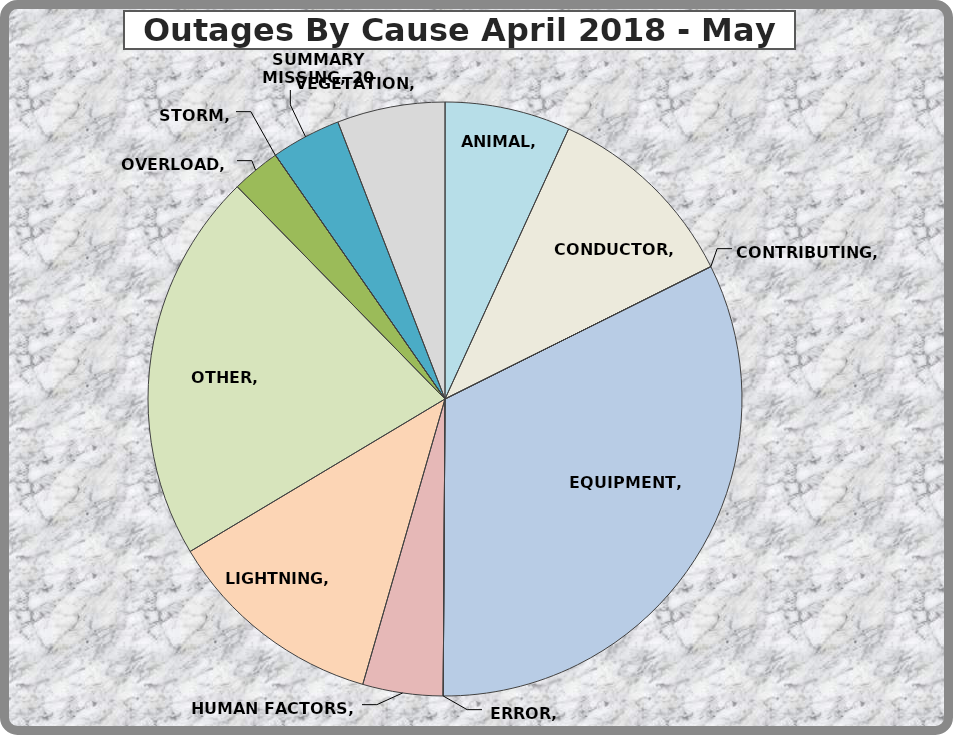
| Category | Series 0 |
|---|---|
| ANIMAL | 36 |
| CONDUCTOR | 57 |
| CONTRIBUTING | 0 |
| EQUIPMENT | 171 |
| ERROR | 0 |
| HUMAN FACTORS | 23 |
| LIGHTNING | 63 |
| OTHER | 112 |
| OVERLOAD | 14 |
| STORM | 0 |
| SUMMARY MISSING | 20 |
| VEGETATION | 31 |